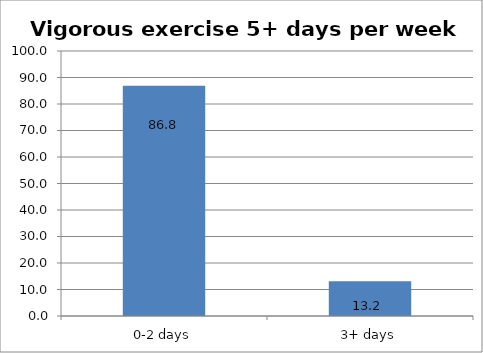
| Category | Series 0 |
|---|---|
| 0-2 days | 86.841 |
| 3+ days | 13.159 |